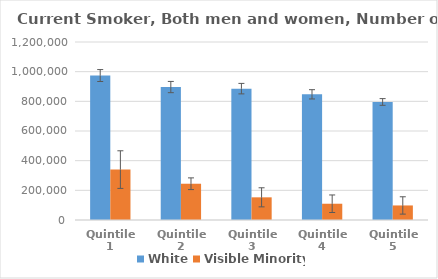
| Category | White | Visible Minority |
|---|---|---|
| Quintile 1 | 973818 | 339823 |
| Quintile 2 | 896285 | 244493 |
| Quintile 3 | 885551 | 152833 |
| Quintile 4 | 847246 | 109676 |
| Quintile 5 | 795743 | 98090 |